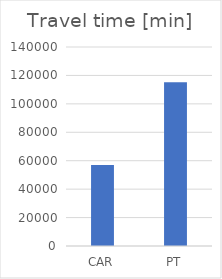
| Category | Series 0 |
|---|---|
| CAR | 56970 |
| PT | 115200 |